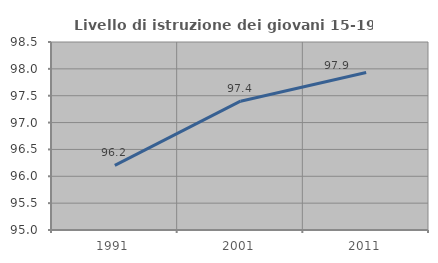
| Category | Livello di istruzione dei giovani 15-19 anni |
|---|---|
| 1991.0 | 96.203 |
| 2001.0 | 97.398 |
| 2011.0 | 97.931 |